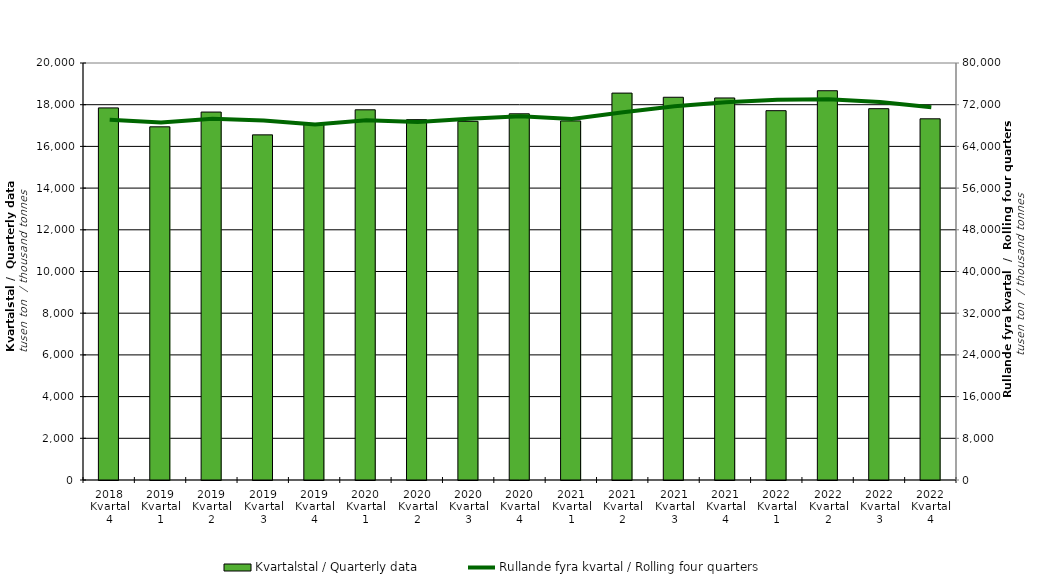
| Category | Kvartalstal / Quarterly data |
|---|---|
| 2018 Kvartal 4 | 17846.541 |
| 2019 Kvartal 1 | 16938.711 |
| 2019 Kvartal 2 | 17647.493 |
| 2019 Kvartal 3 | 16553.159 |
| 2019 Kvartal 4 | 17080.691 |
| 2020 Kvartal 1 | 17755.324 |
| 2020 Kvartal 2 | 17283.081 |
| 2020 Kvartal 3 | 17203.185 |
| 2020 Kvartal 4 | 17563.403 |
| 2021 Kvartal 1 | 17221.505 |
| 2021 Kvartal 2 | 18556.292 |
| 2021 Kvartal 3 | 18357.009 |
| 2021 Kvartal 4 | 18323.49 |
| 2022 Kvartal 1 | 17712.939 |
| 2022 Kvartal 2 | 18670.495 |
| 2022 Kvartal 3 | 17809.293 |
| 2022 Kvartal 4 | 17323.246 |